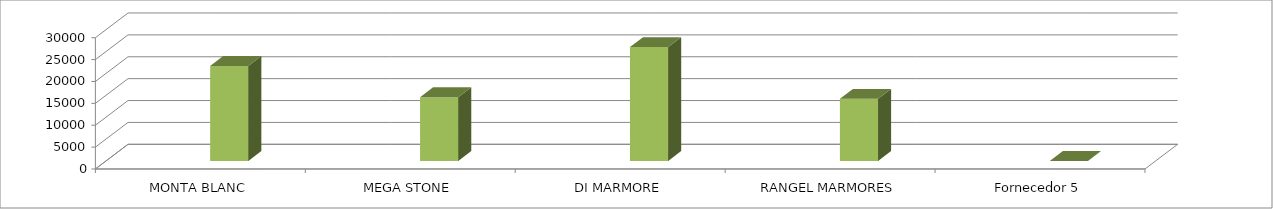
| Category | Series 0 | Series 1 | Series 2 | Series 3 |
|---|---|---|---|---|
| MONTA BLANC |  |  | 21715.33 |  |
| MEGA STONE |  |  | 14573.06 |  |
| DI MARMORE |  |  | 26021.31 |  |
| RANGEL MARMORES |  |  | 14198.79 |  |
| Fornecedor 5 |  |  | 0 |  |